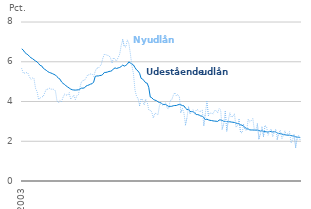
| Category | Udestående udlån | Nyudlån |
|---|---|---|
| 2003-01-01 | 6.649 | 5.652 |
| 2003-02-01 | 6.585 | 5.428 |
| 2003-03-01 | 6.468 | 5.429 |
| 2003-04-01 | 6.404 | 5.454 |
| 2003-05-01 | 6.354 | 5.433 |
| 2003-06-01 | 6.27 | 5.239 |
| 2003-07-01 | 6.201 | 5.121 |
| 2003-08-01 | 6.157 | 5.18 |
| 2003-09-01 | 6.096 | 5.147 |
| 2003-10-01 | 6.039 | 4.662 |
| 2003-11-01 | 5.996 | 4.503 |
| 2003-12-01 | 5.91 | 4.099 |
| 2004-01-01 | 5.817 | 4.172 |
| 2004-02-01 | 5.792 | 4.236 |
| 2004-03-01 | 5.68 | 4.249 |
| 2004-04-01 | 5.62 | 4.436 |
| 2004-05-01 | 5.57 | 4.608 |
| 2004-06-01 | 5.505 | 4.622 |
| 2004-07-01 | 5.463 | 4.669 |
| 2004-08-01 | 5.436 | 4.623 |
| 2004-09-01 | 5.405 | 4.618 |
| 2004-10-01 | 5.366 | 4.612 |
| 2004-11-01 | 5.332 | 4.533 |
| 2004-12-01 | 5.25 | 4.043 |
| 2005-01-01 | 5.173 | 3.933 |
| 2005-02-01 | 5.122 | 4.039 |
| 2005-03-01 | 4.984 | 3.987 |
| 2005-04-01 | 4.907 | 4.218 |
| 2005-05-01 | 4.861 | 4.367 |
| 2005-06-01 | 4.783 | 4.329 |
| 2005-07-01 | 4.73 | 4.313 |
| 2005-08-01 | 4.677 | 4.438 |
| 2005-09-01 | 4.624 | 4.115 |
| 2005-10-01 | 4.59 | 4.202 |
| 2005-11-01 | 4.579 | 4.315 |
| 2005-12-01 | 4.573 | 4.101 |
| 2006-01-01 | 4.581 | 4.288 |
| 2006-02-01 | 4.59 | 4.35 |
| 2006-03-01 | 4.627 | 4.693 |
| 2006-04-01 | 4.671 | 4.996 |
| 2006-05-01 | 4.67 | 5.056 |
| 2006-06-01 | 4.688 | 5.066 |
| 2006-07-01 | 4.776 | 5.184 |
| 2006-08-01 | 4.808 | 5.329 |
| 2006-09-01 | 4.836 | 5.346 |
| 2006-10-01 | 4.875 | 5.381 |
| 2006-11-01 | 4.896 | 5.376 |
| 2006-12-01 | 4.98 | 5.261 |
| 2007-01-01 | 5.264 | 5.512 |
| 2007-02-01 | 5.285 | 5.692 |
| 2007-03-01 | 5.286 | 5.674 |
| 2007-04-01 | 5.306 | 5.763 |
| 2007-05-01 | 5.314 | 5.882 |
| 2007-06-01 | 5.363 | 6.18 |
| 2007-07-01 | 5.463 | 6.378 |
| 2007-08-01 | 5.463 | 6.354 |
| 2007-09-01 | 5.483 | 6.321 |
| 2007-10-01 | 5.513 | 6.307 |
| 2007-11-01 | 5.523 | 6.193 |
| 2007-12-01 | 5.555 | 5.929 |
| 2008-01-01 | 5.649 | 6.212 |
| 2008-02-01 | 5.689 | 6.101 |
| 2008-03-01 | 5.66 | 6.055 |
| 2008-04-01 | 5.691 | 6.209 |
| 2008-05-01 | 5.712 | 6.383 |
| 2008-06-01 | 5.762 | 6.826 |
| 2008-07-01 | 5.832 | 7.103 |
| 2008-08-01 | 5.78 | 6.771 |
| 2008-09-01 | 5.817 | 6.738 |
| 2008-10-01 | 5.879 | 7.099 |
| 2008-11-01 | 5.998 | 6.918 |
| 2008-12-01 | 5.936 | 6.396 |
| 2009-01-01 | 5.889 | 5.797 |
| 2009-02-01 | 5.839 | 5.395 |
| 2009-03-01 | 5.705 | 4.574 |
| 2009-04-01 | 5.594 | 4.266 |
| 2009-05-01 | 5.532 | 4.148 |
| 2009-06-01 | 5.42 | 3.798 |
| 2009-07-01 | 5.166 | 4.113 |
| 2009-08-01 | 5.128 | 4.089 |
| 2009-09-01 | 5.037 | 3.825 |
| 2009-10-01 | 4.941 | 4.115 |
| 2009-11-01 | 4.92 | 3.969 |
| 2009-12-01 | 4.707 | 3.577 |
| 2010-01-01 | 4.223 | 3.548 |
| 2010-02-01 | 4.187 | 3.477 |
| 2010-03-01 | 4.105 | 3.168 |
| 2010-04-01 | 4.068 | 3.409 |
| 2010-05-01 | 4.045 | 3.384 |
| 2010-06-01 | 3.987 | 3.326 |
| 2010-07-01 | 3.947 | 3.793 |
| 2010-08-01 | 3.929 | 3.924 |
| 2010-09-01 | 3.865 | 3.825 |
| 2010-10-01 | 3.846 | 3.856 |
| 2010-11-01 | 3.849 | 3.932 |
| 2010-12-01 | 3.802 | 3.668 |
| 2011-01-01 | 3.751 | 3.629 |
| 2011-02-01 | 3.754 | 4.049 |
| 2011-03-01 | 3.758 | 4.077 |
| 2011-04-01 | 3.786 | 4.303 |
| 2011-05-01 | 3.798 | 4.446 |
| 2011-06-01 | 3.8 | 4.291 |
| 2011-07-01 | 3.832 | 4.353 |
| 2011-08-01 | 3.852 | 4.236 |
| 2011-09-01 | 3.833 | 3.467 |
| 2011-10-01 | 3.795 | 3.65 |
| 2011-11-01 | 3.781 | 3.42 |
| 2011-12-01 | 3.666 | 2.827 |
| 2012-01-01 | 3.593 | 3.199 |
| 2012-02-01 | 3.608 | 3.716 |
| 2012-03-01 | 3.497 | 3.379 |
| 2012-04-01 | 3.498 | 3.443 |
| 2012-05-01 | 3.484 | 3.577 |
| 2012-06-01 | 3.423 | 3.367 |
| 2012-07-01 | 3.348 | 3.563 |
| 2012-08-01 | 3.341 | 3.59 |
| 2012-09-01 | 3.314 | 3.495 |
| 2012-10-01 | 3.27 | 3.512 |
| 2012-11-01 | 3.264 | 3.563 |
| 2012-12-01 | 3.182 | 2.808 |
| 2013-01-01 | 3.091 | 3.405 |
| 2013-02-01 | 3.11 | 4.002 |
| 2013-03-01 | 3.076 | 3.293 |
| 2013-04-01 | 3.051 | 3.42 |
| 2013-05-01 | 3.043 | 3.408 |
| 2013-06-01 | 3.025 | 3.384 |
| 2013-07-01 | 3.015 | 3.537 |
| 2013-08-01 | 3.008 | 3.552 |
| 2013-09-01 | 2.997 | 3.434 |
| 2013-10-01 | 3.066 | 3.636 |
| 2013-11-01 | 3.07 | 3.566 |
| 2013-12-01 | 3.047 | 2.616 |
| 2014-01-01 | 3.004 | 2.895 |
| 2014-02-01 | 2.999 | 3.495 |
| 2014-03-01 | 2.991 | 2.519 |
| 2014-04-01 | 2.981 | 3.061 |
| 2014-05-01 | 2.98 | 3.424 |
| 2014-06-01 | 2.965 | 3.202 |
| 2014-07-01 | 2.956 | 3.254 |
| 2014-08-01 | 2.944 | 3.383 |
| 2014-09-01 | 2.915 | 2.697 |
| 2014-10-01 | 2.892 | 2.805 |
| 2014-11-01 | 2.88 | 3.098 |
| 2014-12-01 | 2.828 | 2.446 |
| 2015-01-01 | 2.808 | 2.42 |
| 2015-02-01 | 2.751 | 2.833 |
| 2015-03-01 | 2.695 | 2.58 |
| 2015-04-01 | 2.621 | 2.531 |
| 2015-05-01 | 2.62 | 3.117 |
| 2015-06-01 | 2.572 | 2.98 |
| 2015-07-01 | 2.567 | 3.042 |
| 2015-08-01 | 2.566 | 3.147 |
| 2015-09-01 | 2.561 | 2.572 |
| 2015-10-01 | 2.56 | 2.578 |
| 2015-11-01 | 2.563 | 2.867 |
| 2015-12-01 | 2.538 | 2.126 |
| 2016-01-01 | 2.512 | 2.38 |
| 2016-02-01 | 2.529 | 2.706 |
| 2016-03-01 | 2.496 | 2.246 |
| 2016-04-01 | 2.481 | 2.799 |
| 2016-05-01 | 2.476 | 2.733 |
| 2016-06-01 | 2.459 | 2.302 |
| 2016-07-01 | 2.496 | 2.49 |
| 2016-08-01 | 2.486 | 2.619 |
| 2016-09-01 | 2.466 | 2.23 |
| 2016-10-01 | 2.479 | 2.451 |
| 2016-11-01 | 2.468 | 2.604 |
| 2016-12-01 | 2.414 | 2.106 |
| 2017-01-01 | 2.389 | 2.439 |
| 2017-02-01 | 2.38 | 2.552 |
| 2017-03-01 | 2.366 | 2.129 |
| 2017-04-01 | 2.333 | 2.306 |
| 2017-05-01 | 2.328 | 2.525 |
| 2017-06-01 | 2.309 | 2.289 |
| 2017-07-01 | 2.307 | 2.415 |
| 2017-08-01 | 2.305 | 2.482 |
| 2017-09-01 | 2.286 | 1.918 |
| 2017-10-01 | 2.269 | 2.086 |
| 2017-11-01 | 2.261 | 2.313 |
| 2017-12-01 | 2.223 | 1.705 |
| 2018-01-01 | 2.205 | 2.154 |
| 2018-02-01 | 2.201 | 2.278 |
| 2018-03-01 | 2.189 | 2.049 |